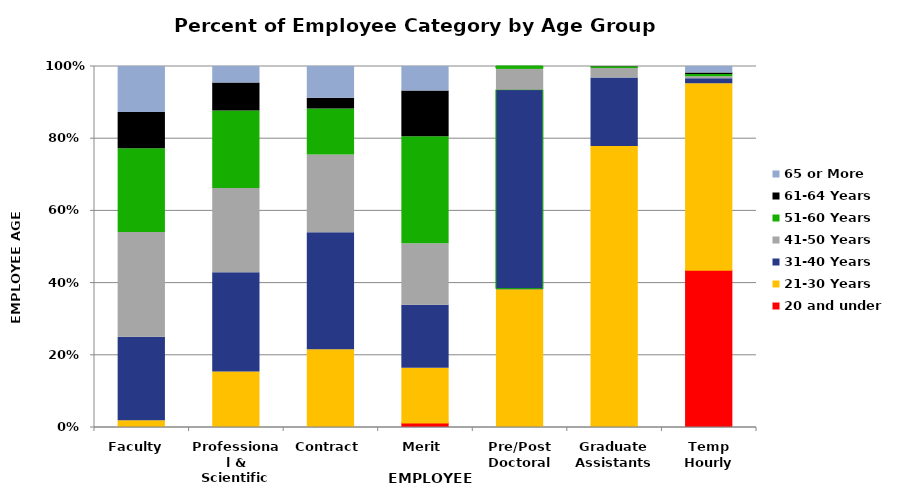
| Category | 20 and under | 21-30 Years | 31-40 Years | 41-50 Years | 51-60 Years | 61-64 Years | 65 or More |
|---|---|---|---|---|---|---|---|
| Faculty  | 0 | 0.019 | 0.231 | 0.29 | 0.232 | 0.101 | 0.127 |
| Professional & Scientific | 0 | 0.154 | 0.275 | 0.233 | 0.215 | 0.078 | 0.046 |
| Contract | 0 | 0.216 | 0.324 | 0.216 | 0.127 | 0.029 | 0.088 |
| Merit | 0.013 | 0.152 | 0.174 | 0.17 | 0.297 | 0.126 | 0.068 |
| Pre/Post Doctoral | 0 | 0.382 | 0.553 | 0.058 | 0.007 | 0 | 0 |
| Graduate Assistants | 0.001 | 0.777 | 0.189 | 0.027 | 0.005 | 0 | 0 |
| Temp Hourly | 0.436 | 0.516 | 0.014 | 0.006 | 0.006 | 0.004 | 0.018 |